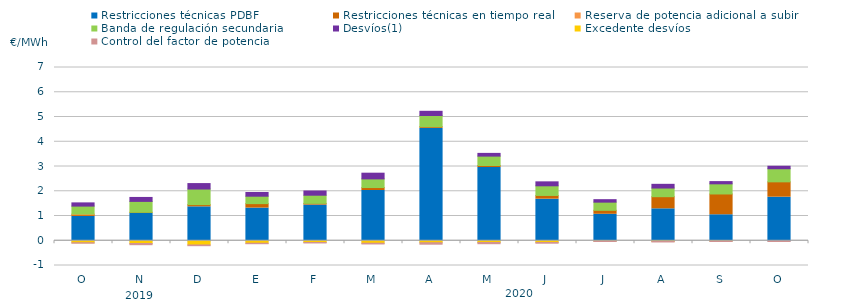
| Category | Restricciones técnicas PDBF | Restricciones técnicas en tiempo real | Reserva de potencia adicional a subir | Banda de regulación secundaria | Desvíos(1) | Excedente desvíos | Control del factor de potencia |
|---|---|---|---|---|---|---|---|
| O | 0.98 | 0.07 | 0.03 | 0.32 | 0.13 | -0.08 | -0.06 |
| N | 1.1 | 0.05 | 0 | 0.44 | 0.16 | -0.11 | -0.09 |
| D | 1.37 | 0.09 | 0 | 0.63 | 0.22 | -0.17 | -0.07 |
| E | 1.32 | 0.18 | 0 | 0.3 | 0.15 | -0.1 | -0.06 |
| F | 1.44 | 0.07 | 0 | 0.33 | 0.17 | -0.07 | -0.06 |
| M | 2.03 | 0.12 | 0 | 0.35 | 0.23 | -0.1 | -0.07 |
| A | 4.54 | 0.07 | 0 | 0.45 | 0.17 | -0.08 | -0.1 |
| M | 2.96 | 0.08 | 0 | 0.38 | 0.11 | -0.07 | -0.09 |
| J | 1.68 | 0.15 | 0 | 0.39 | 0.16 | -0.07 | -0.07 |
| J | 1.07 | 0.16 | 0 | 0.33 | 0.1 | -0.01 | -0.06 |
| A | 1.29 | 0.49 | 0 | 0.35 | 0.15 | -0.03 | -0.06 |
| S | 1.05 | 0.84 | 0 | 0.41 | 0.09 | -0.01 | -0.06 |
| O | 1.76 | 0.62 | 0 | 0.53 | 0.1 | 0 | -0.07 |